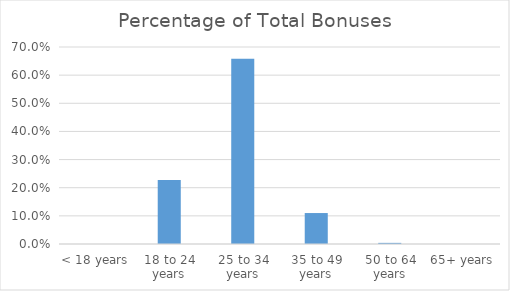
| Category | Series 0 |
|---|---|
| < 18 years | 0 |
| 18 to 24 years | 0.227 |
| 25 to 34 years | 0.658 |
| 35 to 49 years | 0.11 |
| 50 to 64 years | 0.004 |
| 65+ years | 0 |